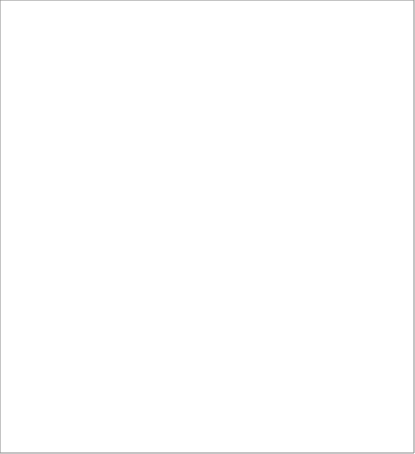
| Category | Series 0 |
|---|---|
| Valsts pensijas | 0 |
| Darba aizsardzība, atbalsts sporta veterāniem, valsts budžeta transferts, | -55239.375 |
| Izdienas pensijas | -77814.055 |
| Atbalsts bezdarba gadījumā | -616500 |
| Sociālā aizsardzība darba nespējas gadījumā | -1905421.365 |
| Atbalsts ģimenēm ar bērniem | -328842.418 |
| Valsts sociālie pabalsti un GMI | -4770984 |